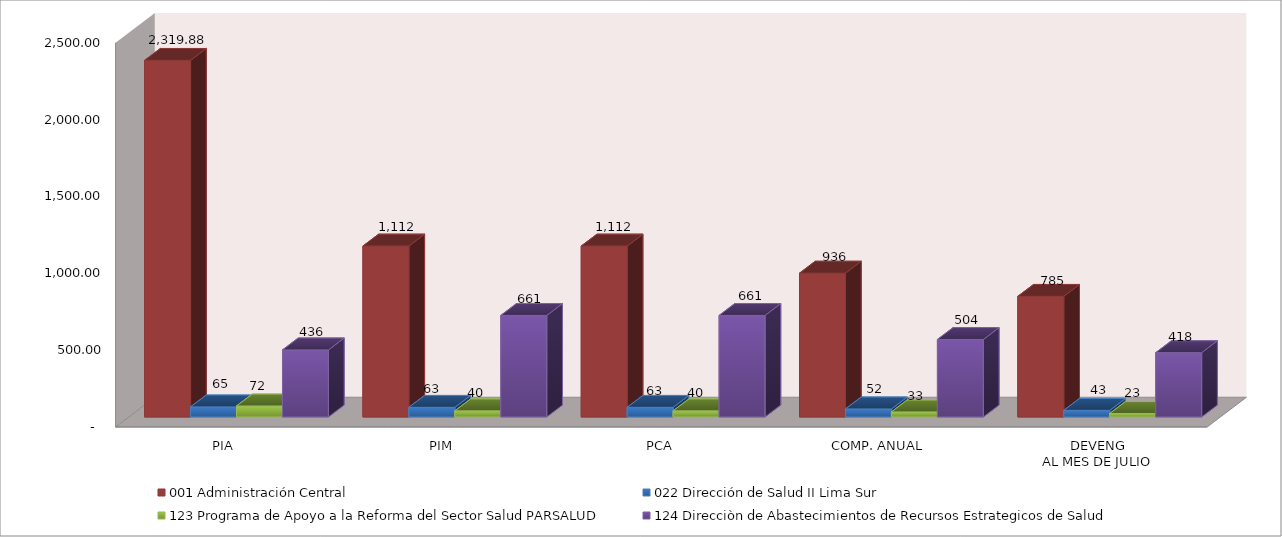
| Category | 001 Administración Central | 022 Dirección de Salud II Lima Sur | 123 Programa de Apoyo a la Reforma del Sector Salud PARSALUD | 124 Direcciòn de Abastecimientos de Recursos Estrategicos de Salud |
|---|---|---|---|---|
| PIA | 2319.877 | 65.372 | 71.532 | 436.35 |
| PIM | 1111.891 | 62.632 | 39.737 | 660.604 |
| PCA | 1111.891 | 62.632 | 39.737 | 660.604 |
| COMP. ANUAL | 935.586 | 52.092 | 32.818 | 504.094 |
| DEVENG
AL MES DE JULIO | 784.567 | 42.879 | 22.623 | 418.291 |